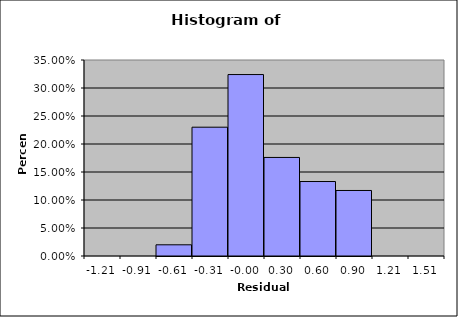
| Category | Series 0 |
|---|---|
| -1.214874811042783 | 0 |
| -0.912069284354835 | 0 |
| -0.609263757666888 | 0.02 |
| -0.30645823097894 | 0.23 |
| -0.00365270429099257 | 0.324 |
| 0.299152822396955 | 0.176 |
| 0.601958349084903 | 0.133 |
| 0.90476387577285 | 0.117 |
| 1.207569402460798 | 0 |
| 1.510374929148746 | 0 |